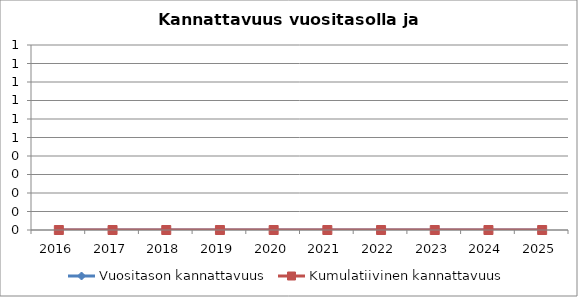
| Category | Vuositason kannattavuus | Kumulatiivinen kannattavuus |
|---|---|---|
| 2016 | 0 | 0 |
| 2017 | 0 | 0 |
| 2018 | 0 | 0 |
| 2019 | 0 | 0 |
| 2020 | 0 | 0 |
| 2021 | 0 | 0 |
| 2022 | 0 | 0 |
| 2023 | 0 | 0 |
| 2024 | 0 | 0 |
| 2025 | 0 | 0 |